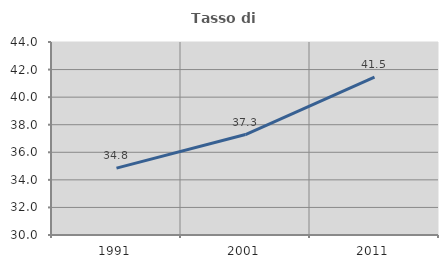
| Category | Tasso di occupazione   |
|---|---|
| 1991.0 | 34.848 |
| 2001.0 | 37.287 |
| 2011.0 | 41.452 |